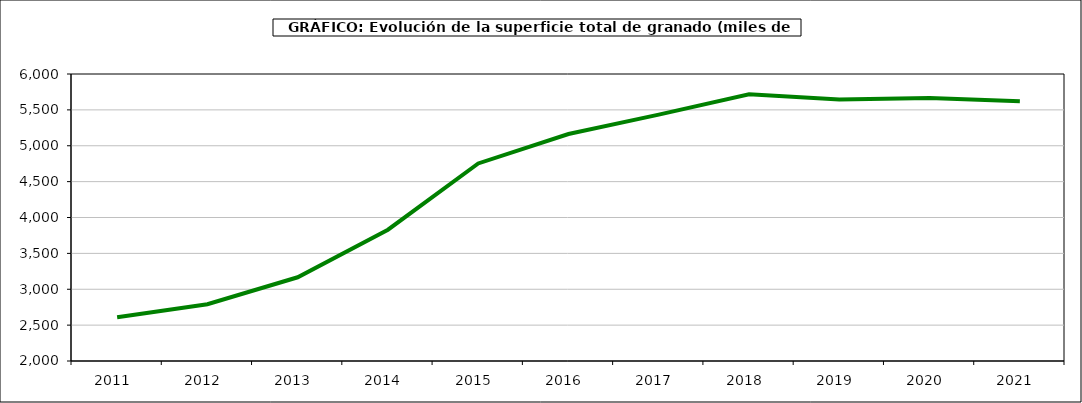
| Category | superficie granado |
|---|---|
| 2011.0 | 2610 |
| 2012.0 | 2791 |
| 2013.0 | 3167 |
| 2014.0 | 3830 |
| 2015.0 | 4753 |
| 2016.0 | 5163 |
| 2017.0 | 5434 |
| 2018.0 | 5716 |
| 2019.0 | 5645 |
| 2020.0 | 5666 |
| 2021.0 | 5619 |